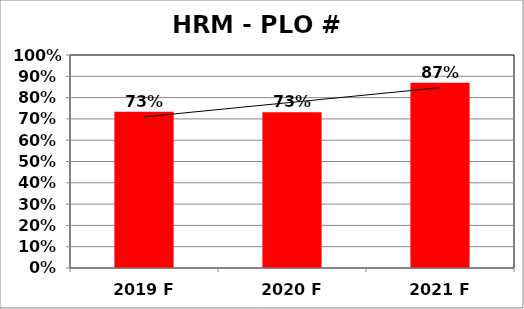
| Category | Series 0 |
|---|---|
| 2019 F | 0.733 |
| 2020 F | 0.731 |
| 2021 F | 0.87 |